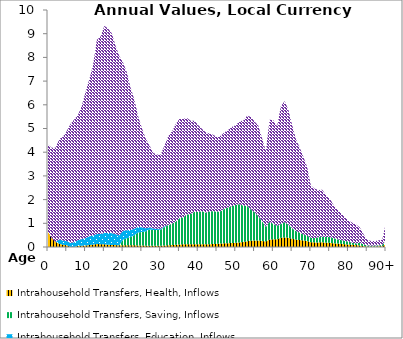
| Category | Intrahousehold Transfers, Health, Inflows | Intrahousehold Transfers, Saving, Inflows | Intrahousehold Transfers, Education, Inflows | Intrahousehold Transfers, Consumption other than health and education, Inflows |
|---|---|---|---|---|
| 0 | 643.51 | 0 | 0 | 3675.799 |
|  | 372.764 | 0 | 0 | 3814.954 |
| 2 | 216.401 | 0 | 0 | 3968.414 |
| 3 | 135.214 | 0 | 181.548 | 4237.11 |
| 4 | 93.779 | 0 | 177.587 | 4386.589 |
| 5 | 71.759 | 0 | 176.482 | 4650.6 |
| 6 | 0 | 0 | 172.878 | 5017.43 |
| 7 | 0 | 0 | 199.859 | 5182.816 |
| 8 | 50.18 | 0 | 241.041 | 5287.729 |
| 9 | 54.981 | 0 | 273.802 | 5633.582 |
| 10 | 62.96 | 0 | 315.338 | 6166.572 |
| 11 | 81.748 | 0 | 367.54 | 6629.013 |
| 12 | 104.028 | 0 | 380.984 | 7191.396 |
| 13 | 122.826 | 0 | 427.516 | 8189.295 |
| 14 | 119.551 | 0 | 435.22 | 8330.852 |
| 15 | 112.936 | 0 | 476.653 | 8740.917 |
| 16 | 95.256 | 0 | 499.015 | 8626.457 |
| 17 | 83.98 | 0 | 499.326 | 8425.232 |
| 18 | 79.334 | 0 | 463.688 | 7941.006 |
| 19 | 77.55 | 0 | 416.58 | 7561.964 |
| 20 | 76.203 | 234.578 | 376.911 | 7093.08 |
| 21 | 78.095 | 289.115 | 342.023 | 6659.608 |
| 22 | 74.978 | 346.011 | 296.402 | 5995.077 |
| 23 | 72.15 | 427.097 | 274.74 | 5452.088 |
| 24 | 64.562 | 546.152 | 237.885 | 4671.466 |
| 25 | 61.032 | 575.686 | 194.125 | 4184.816 |
| 26 | 57.44 | 596.92 | 135.095 | 3791.496 |
| 27 | 54.938 | 683.03 | 89.597 | 3472.603 |
| 28 | 51.176 | 668.516 | 59.432 | 3190.68 |
| 29 | 52.13 | 669.687 | 48.232 | 3138.312 |
| 30 | 54.271 | 671.185 | 40.106 | 3131.932 |
| 31 | 61.774 | 776.223 | 36.106 | 3400.46 |
| 32 | 71.939 | 855.784 | 0 | 3742.765 |
| 33 | 81.898 | 896.606 | 0 | 3891.868 |
| 34 | 94.484 | 976.29 | 0 | 4114.815 |
| 35 | 105.224 | 1105.946 | 0 | 4194.211 |
| 36 | 112.96 | 1134.767 | 0 | 4157.973 |
| 37 | 118.728 | 1248.994 | 0 | 4076.109 |
| 38 | 118.813 | 1274.364 | 0 | 3936.304 |
| 39 | 119.306 | 1368.408 | 0 | 3838.883 |
| 40 | 114.972 | 1360.112 | 0 | 3666.94 |
| 41 | 111.778 | 1404.358 | 0 | 3467.701 |
| 42 | 112.877 | 1335.83 | 0 | 3394.188 |
| 43 | 118.114 | 1381.009 | 0 | 3287.709 |
| 44 | 124.862 | 1391.209 | 0 | 3218.211 |
| 45 | 133.156 | 1356.629 | 0 | 3144.279 |
| 46 | 145.757 | 1363.505 | 0 | 3188.861 |
| 47 | 156.309 | 1463.134 | 0 | 3220.931 |
| 48 | 160.93 | 1505.727 | 0 | 3278.51 |
| 49 | 169.165 | 1556.054 | 0 | 3344.344 |
| 50 | 175.61 | 1603.803 | 0 | 3358.511 |
| 51 | 192.773 | 1614.644 | 0 | 3498.637 |
| 52 | 210.245 | 1536.289 | 0 | 3588.175 |
| 53 | 241.572 | 1496.903 | 0 | 3796.67 |
| 54 | 265.314 | 1323.123 | 0 | 3907.635 |
| 55 | 275.272 | 1192.339 | 0 | 3828.358 |
| 56 | 277.399 | 1022.332 | 0 | 3822.8 |
| 57 | 255.438 | 836.968 | 0 | 3498.519 |
| 58 | 234.256 | 613.028 | 0 | 3205.214 |
| 59 | 316.432 | 745.02 | 0 | 4309.029 |
| 60 | 324.194 | 657.405 | 0 | 4365.819 |
| 61 | 323.548 | 571.172 | 0 | 4199.595 |
| 62 | 392.979 | 581.912 | 0 | 4968.936 |
| 63 | 407.146 | 644.435 | 0 | 5105.132 |
| 64 | 388.399 | 553.93 | 0 | 4850.765 |
| 65 | 348.564 | 440.279 | 0 | 4362.077 |
| 66 | 311.256 | 365.731 | 0 | 3882.465 |
| 67 | 293.377 | 315.756 | 0 | 3592.511 |
| 68 | 277.095 | 255.822 | 0 | 3274.216 |
| 69 | 252.985 | 225.982 | 0 | 2899.352 |
| 70 | 200.172 | 183.125 | 0 | 2210.079 |
| 71 | 194.924 | 182.764 | 0 | 2084.433 |
| 72 | 193.715 | 211.62 | 0 | 1999.935 |
| 73 | 198.104 | 242.053 | 0 | 1979.103 |
| 74 | 183.818 | 238.647 | 0 | 1774.687 |
| 75 | 175.08 | 242.561 | 0 | 1631.57 |
| 76 | 156.191 | 224.405 | 0 | 1398.836 |
| 77 | 145.84 | 182.557 | 0 | 1265.122 |
| 78 | 134.774 | 157.935 | 0 | 1156.421 |
| 79 | 115.701 | 146.324 | 0 | 996.623 |
| 80 | 102.518 | 125.608 | 0 | 890.076 |
| 81 | 93.404 | 89.518 | 0 | 842.554 |
| 82 | 82.306 | 69.313 | 0 | 797.042 |
| 83 | 63.061 | 115.813 | 0 | 654.942 |
| 84 | 37.072 | 80.221 | 0 | 422.082 |
| 85 | 18.192 | 47.214 | 0 | 235.821 |
| 86 | 16.232 | 40.461 | 0 | 197.498 |
| 87 | 20.239 | 39.559 | 0 | 187.928 |
| 88 | 27.27 | 44.398 | 0 | 206.018 |
| 89 | 35.932 | 48.726 | 0 | 220.05 |
| 90+ | 125.164 | 169.731 | 0 | 743.887 |